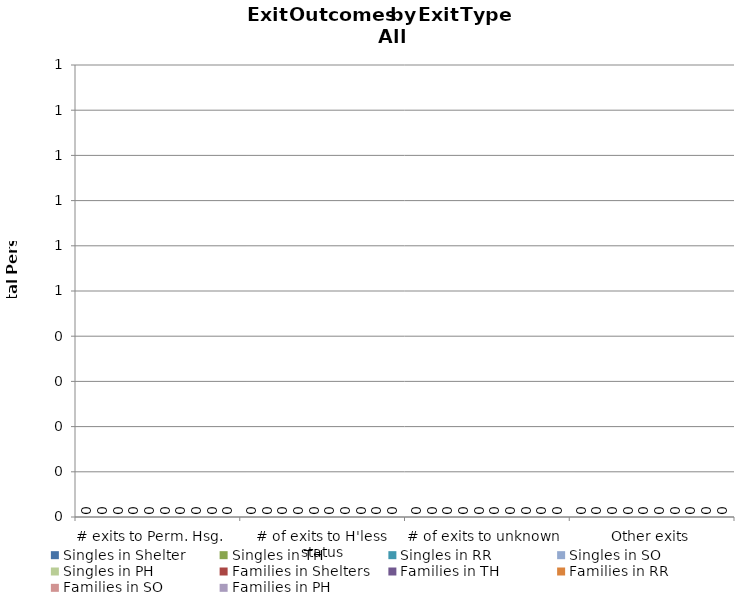
| Category | Singles in Shelter | Singles in TH | Singles in RR | Singles in SO | Singles in PH | Families in Shelters | Families in TH | Families in RR | Families in SO | Families in PH |
|---|---|---|---|---|---|---|---|---|---|---|
| # exits to Perm. Hsg.   | 0 | 0 | 0 | 0 | 0 | 0 | 0 | 0 | 0 | 0 |
| # of exits to H'less status | 0 | 0 | 0 | 0 | 0 | 0 | 0 | 0 | 0 | 0 |
| # of exits to unknown | 0 | 0 | 0 | 0 | 0 | 0 | 0 | 0 | 0 | 0 |
| Other exits | 0 | 0 | 0 | 0 | 0 | 0 | 0 | 0 | 0 | 0 |